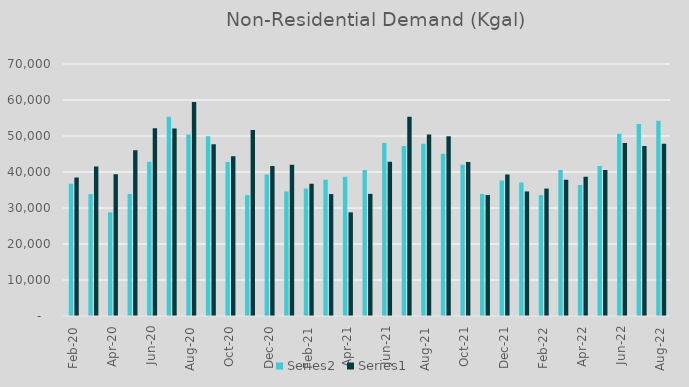
| Category | Series 1 | Series 0 |
|---|---|---|
| 2020-02-01 | 36720 | 38439 |
| 2020-03-01 | 33872 | 41545 |
| 2020-04-01 | 28794 | 39390 |
| 2020-05-01 | 33923 | 46068 |
| 2020-06-01 | 42862 | 52164 |
| 2020-07-01 | 55350 | 52094 |
| 2020-08-01 | 50435 | 59449 |
| 2020-09-01 | 49956 | 47706 |
| 2020-10-01 | 42806 | 44393 |
| 2020-11-01 | 33597 | 51699 |
| 2020-12-01 | 39277 | 41635 |
| 2021-01-01 | 34595 | 42003 |
| 2021-02-01 | 35390 | 36720 |
| 2021-03-01 | 37846 | 33872 |
| 2021-04-01 | 38666 | 28794 |
| 2021-05-01 | 40521 | 33923 |
| 2021-06-01 | 48058 | 42862 |
| 2021-07-01 | 47251 | 55350 |
| 2021-08-01 | 47854 | 50435 |
| 2021-09-01 | 45089 | 49956 |
| 2021-10-01 | 41999 | 42806 |
| 2021-11-01 | 33892 | 33597 |
| 2021-12-01 | 37668 | 39277 |
| 2022-01-01 | 37113 | 34595 |
| 2022-02-01 | 33575 | 35390 |
| 2022-03-01 | 40528 | 37846 |
| 2022-04-01 | 36391 | 38666 |
| 2022-05-01 | 41660 | 40521 |
| 2022-06-01 | 50657 | 48058 |
| 2022-07-01 | 53316 | 47251 |
| 2022-08-01 | 54245 | 47854 |